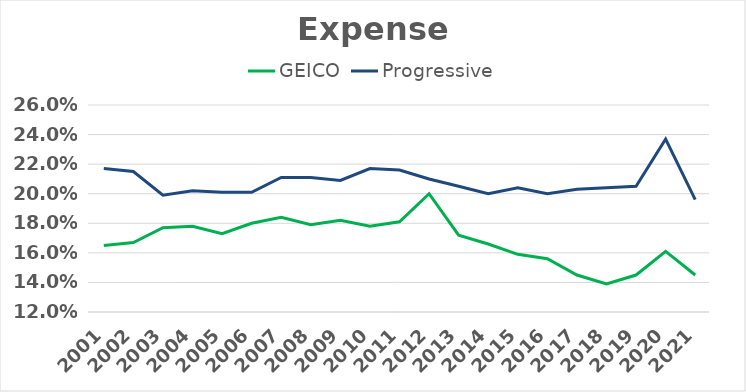
| Category | GEICO | Progressive |
|---|---|---|
| 2001.0 | 0.165 | 0.217 |
| 2002.0 | 0.167 | 0.215 |
| 2003.0 | 0.177 | 0.199 |
| 2004.0 | 0.178 | 0.202 |
| 2005.0 | 0.173 | 0.201 |
| 2006.0 | 0.18 | 0.201 |
| 2007.0 | 0.184 | 0.211 |
| 2008.0 | 0.179 | 0.211 |
| 2009.0 | 0.182 | 0.209 |
| 2010.0 | 0.178 | 0.217 |
| 2011.0 | 0.181 | 0.216 |
| 2012.0 | 0.2 | 0.21 |
| 2013.0 | 0.172 | 0.205 |
| 2014.0 | 0.166 | 0.2 |
| 2015.0 | 0.159 | 0.204 |
| 2016.0 | 0.156 | 0.2 |
| 2017.0 | 0.145 | 0.203 |
| 2018.0 | 0.139 | 0.204 |
| 2019.0 | 0.145 | 0.205 |
| 2020.0 | 0.161 | 0.237 |
| 2021.0 | 0.145 | 0.196 |